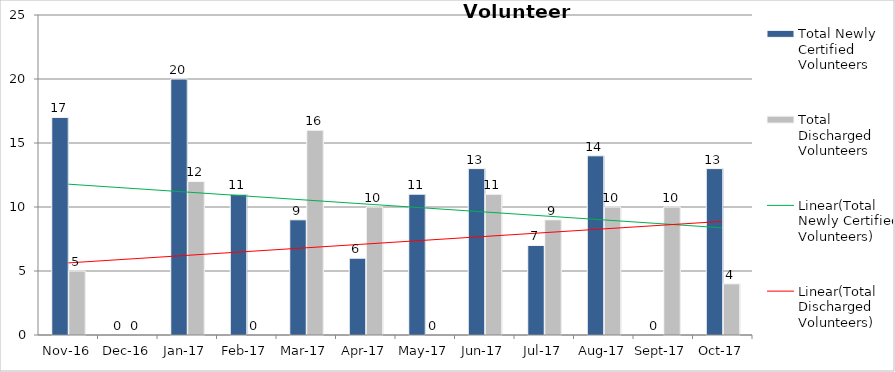
| Category | Total Newly Certified Volunteers | Total Discharged Volunteers |
|---|---|---|
| 2016-11-01 | 17 | 5 |
| 2016-12-01 | 0 | 0 |
| 2017-01-01 | 20 | 12 |
| 2017-02-01 | 11 | 0 |
| 2017-03-01 | 9 | 16 |
| 2017-04-01 | 6 | 10 |
| 2017-05-01 | 11 | 0 |
| 2017-06-01 | 13 | 11 |
| 2017-07-01 | 7 | 9 |
| 2017-08-01 | 14 | 10 |
| 2017-09-01 | 0 | 10 |
| 2017-10-01 | 13 | 4 |